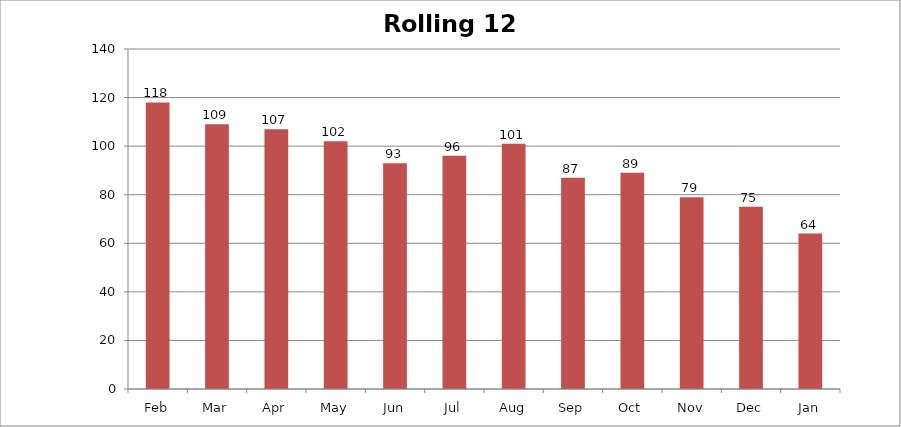
| Category | Rolling 12 Month |
|---|---|
| Feb | 118 |
| Mar | 109 |
| Apr | 107 |
| May | 102 |
| Jun | 93 |
| Jul | 96 |
| Aug | 101 |
| Sep | 87 |
| Oct | 89 |
| Nov | 79 |
| Dec | 75 |
| Jan | 64 |